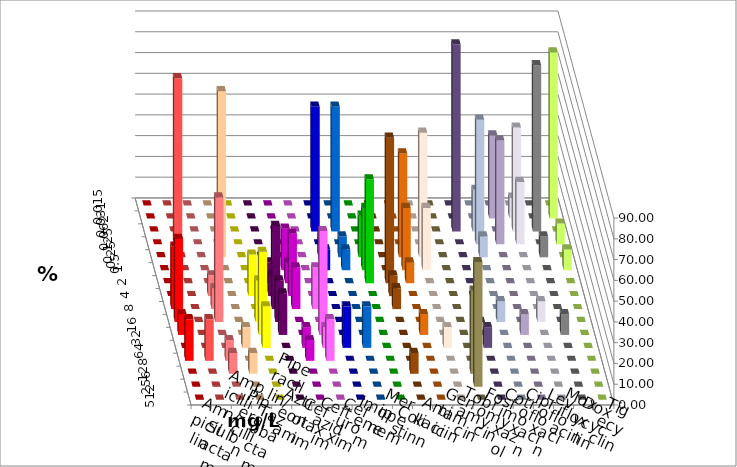
| Category | Ampicillin | Ampicillin/ Sulbactam | Piperacillin | Piperacillin/ Tazobactam | Aztreonam | Cefotaxim | Ceftazidim | Cefuroxim | Imipenem | Meropenem | Colistin | Amikacin | Gentamicin | Tobramycin | Fosfomycin | Cotrimoxazol | Ciprofloxacin | Levofloxacin | Moxifloxacin | Doxycyclin | Tigecyclin |
|---|---|---|---|---|---|---|---|---|---|---|---|---|---|---|---|---|---|---|---|---|---|
| 0.015 | 0 | 0 | 0 | 0 | 0 | 0 | 0 | 0 | 0 | 0 | 0 | 0 | 0 | 0 | 0 | 0 | 0 | 0 | 0 | 0 | 0 |
| 0.031 | 0 | 0 | 0 | 0 | 0 | 0 | 0 | 0 | 0 | 0 | 0 | 0 | 0 | 0 | 0 | 0 | 0 | 40 | 10 | 0 | 80 |
| 0.062 | 0 | 0 | 0 | 0 | 0 | 0 | 0 | 0 | 60 | 60 | 0 | 0 | 0 | 0 | 0 | 90 | 20 | 0 | 50 | 80 | 0 |
| 0.125 | 0 | 80 | 0 | 0 | 0 | 0 | 0 | 0 | 0 | 0 | 0 | 0 | 0 | 0 | 0 | 0 | 60 | 50 | 30 | 0 | 10 |
| 0.25 | 0 | 0 | 0 | 80 | 0 | 0 | 0 | 0 | 10 | 10 | 20 | 0 | 50 | 60 | 0 | 0 | 10 | 0 | 0 | 10 | 0 |
| 0.5 | 0 | 0 | 0 | 0 | 0 | 0 | 20 | 0 | 10 | 10 | 30 | 0 | 30 | 30 | 0 | 0 | 0 | 0 | 0 | 0 | 10 |
| 1.0 | 0 | 0 | 0 | 0 | 0 | 10 | 10 | 0 | 0 | 0 | 50 | 70 | 10 | 0 | 0 | 0 | 0 | 0 | 0 | 0 | 0 |
| 2.0 | 0 | 0 | 10 | 0 | 20 | 10 | 30 | 0 | 0 | 0 | 0 | 10 | 0 | 0 | 0 | 0 | 0 | 0 | 0 | 0 | 0 |
| 4.0 | 30 | 0 | 10 | 0 | 0 | 40 | 20 | 20 | 0 | 0 | 0 | 10 | 0 | 0 | 0 | 0 | 0 | 0 | 0 | 0 | 0 |
| 8.0 | 40 | 0 | 60 | 0 | 20 | 20 | 0 | 0 | 0 | 0 | 0 | 0 | 0 | 0 | 0 | 0 | 10 | 0 | 10 | 0 | 0 |
| 16.0 | 10 | 0 | 0 | 0 | 40 | 20 | 0 | 50 | 0 | 0 | 0 | 0 | 10 | 0 | 0 | 0 | 0 | 10 | 0 | 10 | 0 |
| 32.0 | 0 | 0 | 0 | 10 | 20 | 0 | 10 | 10 | 20 | 20 | 0 | 0 | 0 | 10 | 0 | 10 | 0 | 0 | 0 | 0 | 0 |
| 64.0 | 20 | 20 | 10 | 0 | 0 | 0 | 10 | 20 | 0 | 0 | 0 | 0 | 0 | 0 | 0 | 0 | 0 | 0 | 0 | 0 | 0 |
| 128.0 | 0 | 0 | 10 | 10 | 0 | 0 | 0 | 0 | 0 | 0 | 0 | 10 | 0 | 0 | 40 | 0 | 0 | 0 | 0 | 0 | 0 |
| 256.0 | 0 | 0 | 0 | 0 | 0 | 0 | 0 | 0 | 0 | 0 | 0 | 0 | 0 | 0 | 60 | 0 | 0 | 0 | 0 | 0 | 0 |
| 512.0 | 0 | 0 | 0 | 0 | 0 | 0 | 0 | 0 | 0 | 0 | 0 | 0 | 0 | 0 | 0 | 0 | 0 | 0 | 0 | 0 | 0 |